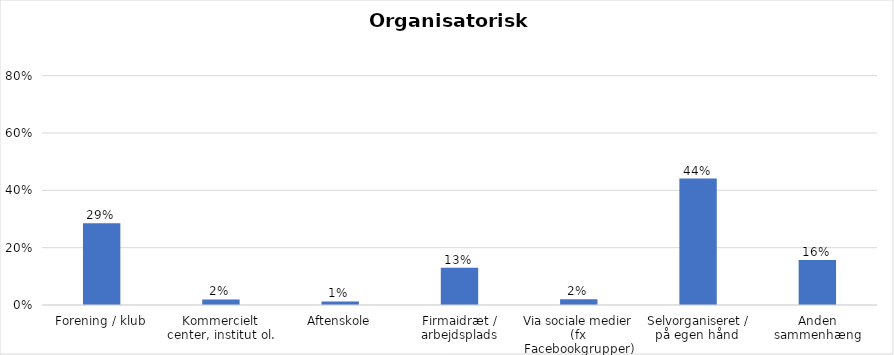
| Category | % |
|---|---|
| Forening / klub | 0.285 |
| Kommercielt center, institut ol. | 0.02 |
| Aftenskole | 0.013 |
| Firmaidræt / arbejdsplads | 0.13 |
| Via sociale medier (fx Facebookgrupper) | 0.02 |
| Selvorganiseret / på egen hånd  | 0.441 |
| Anden sammenhæng | 0.157 |